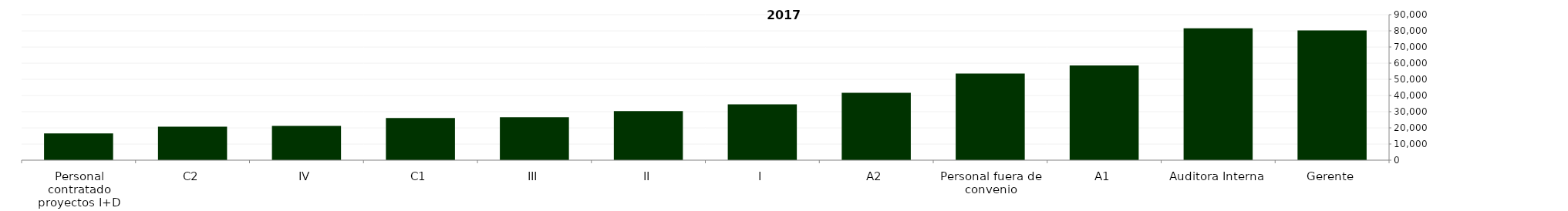
| Category | 2017 |
|---|---|
| Gerente | 80260.76 |
| Auditora Interna | 81573.57 |
| A1 | 58536.221 |
| Personal fuera de convenio | 53512.241 |
| A2 | 41689.283 |
| I | 34493.981 |
| II | 30408.568 |
| III | 26540.71 |
| C1 | 26081.35 |
| IV | 21165.511 |
| C2 | 20673.034 |
| Personal contratado proyectos I+D | 16495.374 |